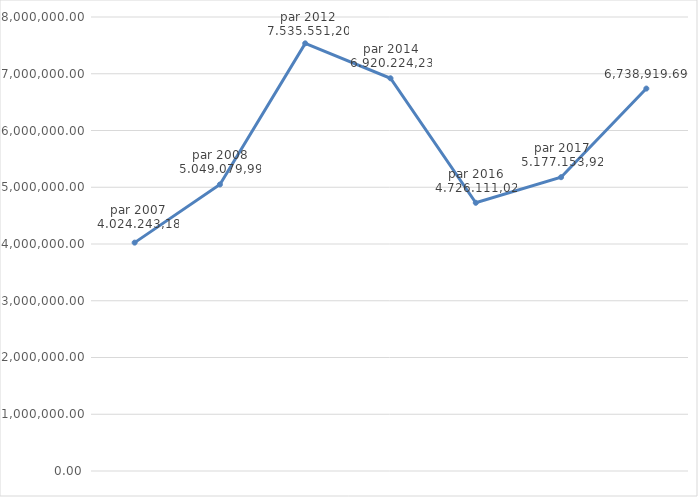
| Category | Iznos EUR |
|---|---|
| par 2007 | 4024243.179 |
| par 2008 | 5049079.987 |
| par 2012 | 7535551.197 |
| par 2014 | 6920224.235 |
| par 2016 | 4726111.021 |
| pr 2017 | 5177153.921 |
| par 2020 | 6738919.691 |